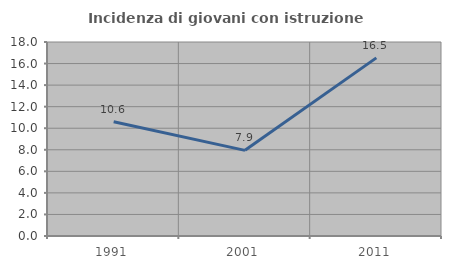
| Category | Incidenza di giovani con istruzione universitaria |
|---|---|
| 1991.0 | 10.606 |
| 2001.0 | 7.947 |
| 2011.0 | 16.529 |